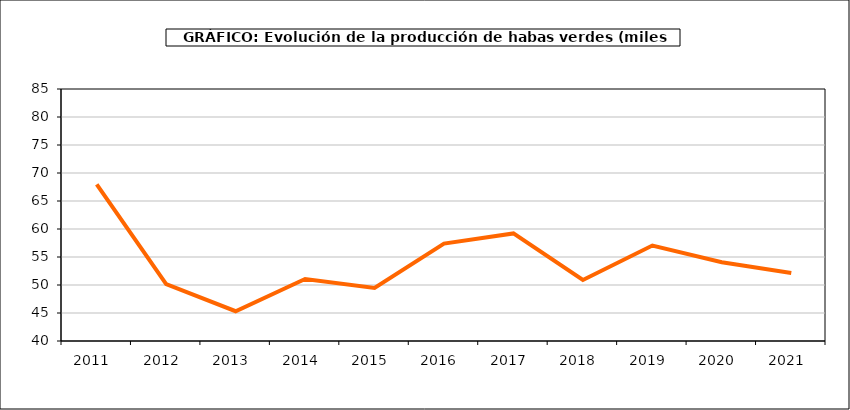
| Category | producción |
|---|---|
| 2011.0 | 67.971 |
| 2012.0 | 50.149 |
| 2013.0 | 45.318 |
| 2014.0 | 51.081 |
| 2015.0 | 49.478 |
| 2016.0 | 57.4 |
| 2017.0 | 59.21 |
| 2018.0 | 50.9 |
| 2019.0 | 57.049 |
| 2020.0 | 54.067 |
| 2021.0 | 52.13 |